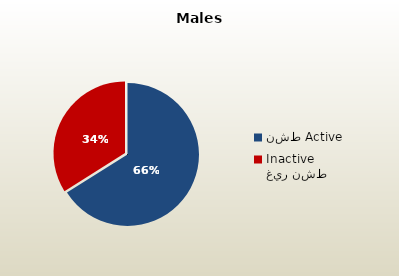
| Category | الذكور القطريين  Qatari Males |
|---|---|
| نشط Active | 70970 |
| غير نشط Inactive | 36454 |